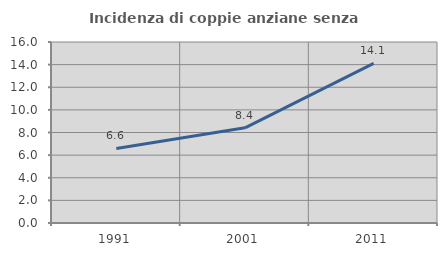
| Category | Incidenza di coppie anziane senza figli  |
|---|---|
| 1991.0 | 6.592 |
| 2001.0 | 8.411 |
| 2011.0 | 14.115 |